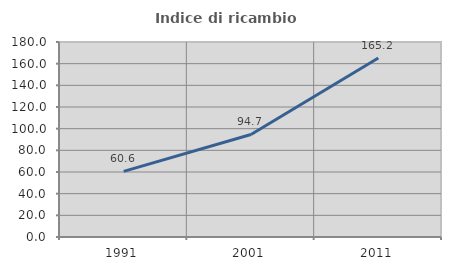
| Category | Indice di ricambio occupazionale  |
|---|---|
| 1991.0 | 60.619 |
| 2001.0 | 94.676 |
| 2011.0 | 165.169 |